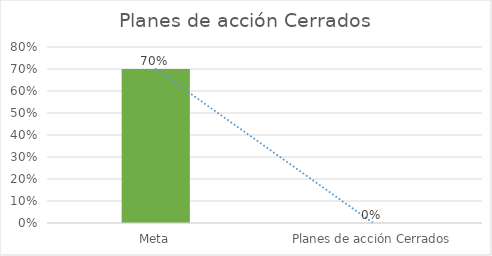
| Category | Series 0 |
|---|---|
| Meta | 0.7 |
| Planes de acción Cerrados | 0 |